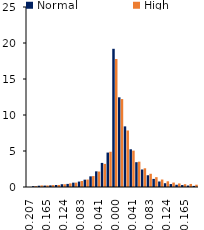
| Category | Normal | High |
|---|---|---|
| -0.206762101838239 | 0.002 | 0.002 |
| -0.19297796171569 | 0.112 | 0.126 |
| -0.179193821593141 | 0.179 | 0.222 |
| -0.165409681470591 | 0.197 | 0.215 |
| -0.151625541348042 | 0.228 | 0.268 |
| -0.137841401225493 | 0.276 | 0.286 |
| -0.124057261102944 | 0.385 | 0.386 |
| -0.110273120980394 | 0.43 | 0.506 |
| -0.096488980857845 | 0.603 | 0.608 |
| -0.0827048407352957 | 0.755 | 0.836 |
| -0.0689207006127464 | 1.019 | 1.036 |
| -0.0551365604901971 | 1.479 | 1.517 |
| -0.0413524203676478 | 2.173 | 2.146 |
| -0.0275682802450986 | 3.347 | 3.211 |
| -0.0137841401225493 | 4.782 | 4.898 |
| 1.38777878078145e-17 | 19.195 | 17.781 |
| 0.0137841401225493 | 12.457 | 12.213 |
| 0.0275682802450986 | 8.419 | 7.849 |
| 0.0413524203676478 | 5.238 | 5.049 |
| 0.0551365604901971 | 3.444 | 3.517 |
| 0.0689207006127464 | 2.432 | 2.599 |
| 0.0827048407352957 | 1.63 | 1.836 |
| 0.096488980857845 | 1.124 | 1.366 |
| 0.110273120980394 | 0.766 | 1.038 |
| 0.124057261102944 | 0.522 | 0.792 |
| 0.137841401225493 | 0.409 | 0.616 |
| 0.151625541348042 | 0.311 | 0.494 |
| 0.165409681470591 | 0.272 | 0.392 |
| 0.179193821593141 | 0.204 | 0.426 |
| 0.19297796171569 | 0.155 | 0.317 |